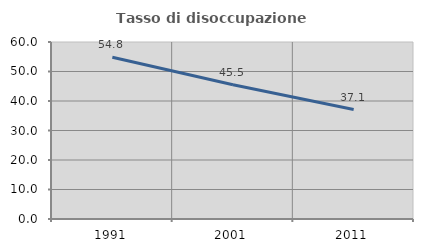
| Category | Tasso di disoccupazione giovanile  |
|---|---|
| 1991.0 | 54.816 |
| 2001.0 | 45.501 |
| 2011.0 | 37.113 |